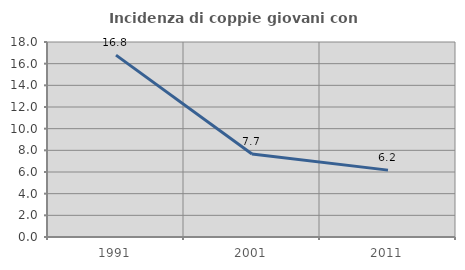
| Category | Incidenza di coppie giovani con figli |
|---|---|
| 1991.0 | 16.788 |
| 2001.0 | 7.654 |
| 2011.0 | 6.173 |